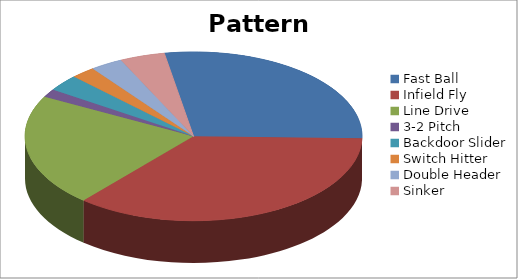
| Category | Pattern Distribution |
|---|---|
| Fast Ball | 72 |
| Infield Fly | 92 |
| Line Drive | 55 |
| 3-2 Pitch | 4 |
| Backdoor Slider | 8 |
| Switch Hitter | 6 |
| Double Header | 8 |
| Sinker | 11 |